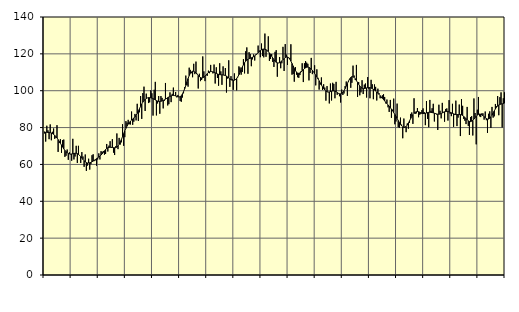
| Category | Piggar | Series 1 |
|---|---|---|
| nan | 77.8 | 76.91 |
| 87.0 | 72.4 | 77.47 |
| 87.0 | 81 | 77.44 |
| 87.0 | 78.5 | 77.36 |
| 87.0 | 73.7 | 77.3 |
| 87.0 | 81.7 | 77.23 |
| 87.0 | 73.1 | 77.07 |
| 87.0 | 77.7 | 76.74 |
| 87.0 | 79.5 | 76.33 |
| 87.0 | 73.9 | 75.8 |
| 87.0 | 74.5 | 75.13 |
| 87.0 | 81.3 | 74.35 |
| nan | 66.8 | 73.46 |
| 88.0 | 71.6 | 72.53 |
| 88.0 | 73.7 | 71.52 |
| 88.0 | 66.3 | 70.47 |
| 88.0 | 73.2 | 69.45 |
| 88.0 | 73.5 | 68.48 |
| 88.0 | 64.1 | 67.63 |
| 88.0 | 64.7 | 66.92 |
| 88.0 | 68.1 | 66.35 |
| 88.0 | 62.5 | 65.95 |
| 88.0 | 66.6 | 65.73 |
| 88.0 | 65.5 | 65.64 |
| nan | 62 | 65.68 |
| 89.0 | 73.9 | 65.81 |
| 89.0 | 62.7 | 65.97 |
| 89.0 | 64.3 | 66.07 |
| 89.0 | 70.1 | 66.05 |
| 89.0 | 60.8 | 65.84 |
| 89.0 | 70.1 | 65.46 |
| 89.0 | 65 | 64.93 |
| 89.0 | 60.8 | 64.23 |
| 89.0 | 66.7 | 63.44 |
| 89.0 | 64.3 | 62.65 |
| 89.0 | 58.7 | 61.94 |
| nan | 65.4 | 61.39 |
| 90.0 | 56.5 | 61 |
| 90.0 | 59.4 | 60.78 |
| 90.0 | 63.1 | 60.76 |
| 90.0 | 57.2 | 60.88 |
| 90.0 | 60.1 | 61.1 |
| 90.0 | 65 | 61.43 |
| 90.0 | 65.5 | 61.81 |
| 90.0 | 61.8 | 62.23 |
| 90.0 | 62.2 | 62.67 |
| 90.0 | 59.3 | 63.1 |
| 90.0 | 62.7 | 63.53 |
| nan | 66 | 63.99 |
| 91.0 | 62.7 | 64.49 |
| 91.0 | 67.2 | 65.08 |
| 91.0 | 66.8 | 65.78 |
| 91.0 | 67.3 | 66.55 |
| 91.0 | 65.3 | 67.35 |
| 91.0 | 65.7 | 68.09 |
| 91.0 | 71.1 | 68.66 |
| 91.0 | 67 | 69.05 |
| 91.0 | 70.2 | 69.28 |
| 91.0 | 72.6 | 69.33 |
| 91.0 | 69 | 69.28 |
| nan | 73.7 | 69.18 |
| 92.0 | 66.4 | 69.08 |
| 92.0 | 65.1 | 69.04 |
| 92.0 | 69.9 | 69.11 |
| 92.0 | 76.8 | 69.41 |
| 92.0 | 68.3 | 70 |
| 92.0 | 74.4 | 70.9 |
| 92.0 | 70.8 | 72.09 |
| 92.0 | 72 | 73.52 |
| 92.0 | 81.8 | 75.09 |
| 92.0 | 70.1 | 76.69 |
| 92.0 | 74.8 | 78.2 |
| nan | 83.5 | 79.59 |
| 93.0 | 82.7 | 80.82 |
| 93.0 | 84.2 | 81.87 |
| 93.0 | 81.8 | 82.77 |
| 93.0 | 81.7 | 83.51 |
| 93.0 | 88.7 | 84.09 |
| 93.0 | 81.5 | 84.62 |
| 93.0 | 83.2 | 85.16 |
| 93.0 | 87.4 | 85.82 |
| 93.0 | 83.9 | 86.65 |
| 93.0 | 92.9 | 87.69 |
| 93.0 | 83.6 | 88.93 |
| nan | 88.3 | 90.23 |
| 94.0 | 97.1 | 91.54 |
| 94.0 | 84.7 | 92.77 |
| 94.0 | 98.7 | 93.8 |
| 94.0 | 102.2 | 94.65 |
| 94.0 | 89 | 95.31 |
| 94.0 | 98.4 | 95.76 |
| 94.0 | 96.1 | 96.08 |
| 94.0 | 93.3 | 96.25 |
| 94.0 | 93.7 | 96.26 |
| 94.0 | 100.2 | 96.16 |
| 94.0 | 98.6 | 95.98 |
| nan | 86.5 | 95.71 |
| 95.0 | 100.5 | 95.35 |
| 95.0 | 104.8 | 94.97 |
| 95.0 | 86.6 | 94.65 |
| 95.0 | 93.1 | 94.37 |
| 95.0 | 97.1 | 94.2 |
| 95.0 | 87.5 | 94.18 |
| 95.0 | 97.1 | 94.26 |
| 95.0 | 96.1 | 94.45 |
| 95.0 | 90.4 | 94.73 |
| 95.0 | 94.5 | 95.06 |
| 95.0 | 104.2 | 95.43 |
| nan | 95.6 | 95.82 |
| 96.0 | 92 | 96.23 |
| 96.0 | 92.7 | 96.6 |
| 96.0 | 99.1 | 96.92 |
| 96.0 | 93.8 | 97.22 |
| 96.0 | 98.3 | 97.42 |
| 96.0 | 101.7 | 97.46 |
| 96.0 | 97.3 | 97.37 |
| 96.0 | 99.3 | 97.17 |
| 96.0 | 96.4 | 96.93 |
| 96.0 | 97.7 | 96.72 |
| 96.0 | 96.6 | 96.61 |
| nan | 94.4 | 96.75 |
| 97.0 | 94 | 97.25 |
| 97.0 | 96.3 | 98.19 |
| 97.0 | 98.6 | 99.49 |
| 97.0 | 101.9 | 101.09 |
| 97.0 | 108.2 | 102.91 |
| 97.0 | 103 | 104.81 |
| 97.0 | 102.2 | 106.61 |
| 97.0 | 112.5 | 108.19 |
| 97.0 | 111.3 | 109.43 |
| 97.0 | 109.5 | 110.22 |
| 97.0 | 107.3 | 110.58 |
| nan | 114.6 | 110.55 |
| 98.0 | 109 | 110.22 |
| 98.0 | 115.8 | 109.67 |
| 98.0 | 109.2 | 109 |
| 98.0 | 101.2 | 108.28 |
| 98.0 | 109.2 | 107.63 |
| 98.0 | 105.2 | 107.15 |
| 98.0 | 105.8 | 106.93 |
| 98.0 | 118.6 | 107.01 |
| 98.0 | 110.5 | 107.33 |
| 98.0 | 105.2 | 107.86 |
| 98.0 | 108.4 | 108.56 |
| nan | 108.1 | 109.27 |
| 99.0 | 110.9 | 109.84 |
| 99.0 | 109.5 | 110.23 |
| 99.0 | 114 | 110.4 |
| 99.0 | 110.4 | 110.39 |
| 99.0 | 109.4 | 110.22 |
| 99.0 | 114.2 | 109.97 |
| 99.0 | 103.9 | 109.7 |
| 99.0 | 112.7 | 109.39 |
| 99.0 | 106.9 | 109.11 |
| 99.0 | 102.7 | 108.87 |
| 99.0 | 114.9 | 108.72 |
| nan | 110.5 | 108.65 |
| 0.0 | 103.2 | 108.62 |
| 0.0 | 113.2 | 108.56 |
| 0.0 | 108.3 | 108.45 |
| 0.0 | 112.3 | 108.24 |
| 0.0 | 99 | 107.92 |
| 0.0 | 106.6 | 107.46 |
| 0.0 | 116.5 | 106.93 |
| 0.0 | 102.1 | 106.43 |
| 0.0 | 107.9 | 105.99 |
| 0.0 | 106.4 | 105.72 |
| 0.0 | 100.5 | 105.64 |
| nan | 109.4 | 105.71 |
| 1.0 | 106.3 | 106.04 |
| 1.0 | 100.2 | 106.66 |
| 1.0 | 107.3 | 107.52 |
| 1.0 | 113.2 | 108.64 |
| 1.0 | 112.6 | 109.97 |
| 1.0 | 108.7 | 111.41 |
| 1.0 | 110.2 | 112.82 |
| 1.0 | 117.1 | 114.08 |
| 1.0 | 109.4 | 115.18 |
| 1.0 | 121.4 | 116.02 |
| 1.0 | 123.5 | 116.63 |
| nan | 109.2 | 117.06 |
| 2.0 | 120.9 | 117.34 |
| 2.0 | 119.9 | 117.58 |
| 2.0 | 113.3 | 117.86 |
| 2.0 | 117 | 118.14 |
| 2.0 | 119.7 | 118.47 |
| 2.0 | 116.4 | 118.89 |
| 2.0 | 119.7 | 119.4 |
| 2.0 | 120 | 119.97 |
| 2.0 | 124.5 | 120.59 |
| 2.0 | 121.8 | 121.21 |
| 2.0 | 118.2 | 121.75 |
| nan | 125.6 | 122.21 |
| 3.0 | 118.8 | 122.53 |
| 3.0 | 118.1 | 122.62 |
| 3.0 | 131 | 122.51 |
| 3.0 | 118.4 | 122.24 |
| 3.0 | 121.9 | 121.79 |
| 3.0 | 129.5 | 121.19 |
| 3.0 | 116.2 | 120.49 |
| 3.0 | 117.2 | 119.64 |
| 3.0 | 119.9 | 118.7 |
| 3.0 | 115.6 | 117.72 |
| 3.0 | 112.9 | 116.77 |
| nan | 121.1 | 115.98 |
| 4.0 | 122 | 115.42 |
| 4.0 | 107.6 | 115.13 |
| 4.0 | 115 | 115.07 |
| 4.0 | 118.3 | 115.22 |
| 4.0 | 112.2 | 115.63 |
| 4.0 | 114.9 | 116.18 |
| 4.0 | 123.8 | 116.79 |
| 4.0 | 110.7 | 117.41 |
| 4.0 | 125.3 | 117.93 |
| 4.0 | 119.6 | 118.25 |
| 4.0 | 114 | 118.27 |
| nan | 118.1 | 117.92 |
| 5.0 | 117.8 | 117.14 |
| 5.0 | 125.2 | 116.05 |
| 5.0 | 108.7 | 114.78 |
| 5.0 | 109.1 | 113.41 |
| 5.0 | 104.9 | 112.07 |
| 5.0 | 112.8 | 110.91 |
| 5.0 | 108.7 | 110.04 |
| 5.0 | 107.3 | 109.55 |
| 5.0 | 107 | 109.44 |
| 5.0 | 108.5 | 109.64 |
| 5.0 | 110.6 | 110.11 |
| nan | 114.9 | 110.74 |
| 6.0 | 104.7 | 111.41 |
| 6.0 | 114.9 | 112 |
| 6.0 | 116.1 | 112.44 |
| 6.0 | 115.2 | 112.74 |
| 6.0 | 114.6 | 112.84 |
| 6.0 | 105.6 | 112.67 |
| 6.0 | 109.6 | 112.29 |
| 6.0 | 117.8 | 111.74 |
| 6.0 | 109 | 111.03 |
| 6.0 | 110.2 | 110.25 |
| 6.0 | 113.8 | 109.37 |
| nan | 102.9 | 108.43 |
| 7.0 | 111.6 | 107.45 |
| 7.0 | 107 | 106.44 |
| 7.0 | 100.6 | 105.37 |
| 7.0 | 103.4 | 104.25 |
| 7.0 | 107.2 | 103.12 |
| 7.0 | 100.4 | 102.08 |
| 7.0 | 103.5 | 101.16 |
| 7.0 | 101.7 | 100.39 |
| 7.0 | 94.6 | 99.79 |
| 7.0 | 102.5 | 99.43 |
| 7.0 | 99.2 | 99.3 |
| nan | 93.1 | 99.35 |
| 8.0 | 103.9 | 99.53 |
| 8.0 | 94.7 | 99.72 |
| 8.0 | 104.3 | 99.87 |
| 8.0 | 103.7 | 99.89 |
| 8.0 | 95.9 | 99.73 |
| 8.0 | 104.8 | 99.41 |
| 8.0 | 97.8 | 99 |
| 8.0 | 98.5 | 98.6 |
| 8.0 | 97 | 98.34 |
| 8.0 | 93.6 | 98.3 |
| 8.0 | 100.6 | 98.54 |
| nan | 97.7 | 99.11 |
| 9.0 | 98.5 | 99.99 |
| 9.0 | 102.5 | 101.14 |
| 9.0 | 105 | 102.49 |
| 9.0 | 97.2 | 103.9 |
| 9.0 | 104.9 | 105.26 |
| 9.0 | 106.1 | 106.41 |
| 9.0 | 101.6 | 107.21 |
| 9.0 | 104.3 | 107.62 |
| 9.0 | 113.6 | 107.6 |
| 9.0 | 108.2 | 107.21 |
| 9.0 | 105.8 | 106.48 |
| nan | 114 | 105.52 |
| 10.0 | 96.6 | 104.47 |
| 10.0 | 104.7 | 103.45 |
| 10.0 | 97.5 | 102.51 |
| 10.0 | 99.1 | 101.8 |
| 10.0 | 105.7 | 101.34 |
| 10.0 | 98.2 | 101.14 |
| 10.0 | 103.3 | 101.16 |
| 10.0 | 103.9 | 101.33 |
| 10.0 | 96.3 | 101.53 |
| 10.0 | 107.4 | 101.67 |
| 10.0 | 101 | 101.72 |
| nan | 95.9 | 101.63 |
| 11.0 | 105.9 | 101.42 |
| 11.0 | 103.5 | 101.14 |
| 11.0 | 95.4 | 100.77 |
| 11.0 | 103.4 | 100.34 |
| 11.0 | 102.1 | 99.83 |
| 11.0 | 94.7 | 99.26 |
| 11.0 | 101.1 | 98.64 |
| 11.0 | 98.7 | 97.99 |
| 11.0 | 95.9 | 97.33 |
| 11.0 | 96 | 96.62 |
| 11.0 | 97.5 | 95.88 |
| nan | 98.1 | 95.17 |
| 12.0 | 96.6 | 94.46 |
| 12.0 | 93.1 | 93.72 |
| 12.0 | 95.2 | 93 |
| 12.0 | 91 | 92.29 |
| 12.0 | 88.5 | 91.54 |
| 12.0 | 95 | 90.78 |
| 12.0 | 85.3 | 89.99 |
| 12.0 | 89.7 | 89.1 |
| 12.0 | 95.7 | 88.15 |
| 12.0 | 81.8 | 87.14 |
| 12.0 | 83.3 | 86.07 |
| nan | 93 | 84.97 |
| 13.0 | 80.2 | 83.85 |
| 13.0 | 79.8 | 82.75 |
| 13.0 | 85.4 | 81.75 |
| 13.0 | 81.6 | 80.92 |
| 13.0 | 74.2 | 80.34 |
| 13.0 | 84.9 | 80.08 |
| 13.0 | 80.4 | 80.16 |
| 13.0 | 77.5 | 80.62 |
| 13.0 | 82.2 | 81.39 |
| 13.0 | 79.4 | 82.43 |
| 13.0 | 82.6 | 83.65 |
| nan | 87.4 | 84.87 |
| 14.0 | 88.2 | 85.99 |
| 14.0 | 82 | 87 |
| 14.0 | 95.9 | 87.78 |
| 14.0 | 87.4 | 88.29 |
| 14.0 | 87.7 | 88.61 |
| 14.0 | 90.6 | 88.71 |
| 14.0 | 85.6 | 88.6 |
| 14.0 | 87 | 88.36 |
| 14.0 | 87.3 | 88.05 |
| 14.0 | 89.5 | 87.79 |
| 14.0 | 90.4 | 87.63 |
| nan | 88.4 | 87.6 |
| 15.0 | 81.3 | 87.72 |
| 15.0 | 94.4 | 87.93 |
| 15.0 | 84.7 | 88.14 |
| 15.0 | 80.2 | 88.28 |
| 15.0 | 95 | 88.33 |
| 15.0 | 89.1 | 88.27 |
| 15.0 | 90.5 | 88.15 |
| 15.0 | 92.9 | 87.99 |
| 15.0 | 83.3 | 87.79 |
| 15.0 | 87.4 | 87.6 |
| 15.0 | 87.1 | 87.4 |
| nan | 78.7 | 87.26 |
| 16.0 | 92.4 | 87.25 |
| 16.0 | 89.1 | 87.35 |
| 16.0 | 85 | 87.57 |
| 16.0 | 93.4 | 87.93 |
| 16.0 | 88.5 | 88.28 |
| 16.0 | 83.2 | 88.55 |
| 16.0 | 90.1 | 88.71 |
| 16.0 | 90.4 | 88.73 |
| 16.0 | 83.8 | 88.67 |
| 16.0 | 94.9 | 88.54 |
| 16.0 | 87.5 | 88.3 |
| nan | 86.2 | 88.02 |
| 17.0 | 92.9 | 87.73 |
| 17.0 | 80.4 | 87.46 |
| 17.0 | 86.8 | 87.23 |
| 17.0 | 94.6 | 87.07 |
| 17.0 | 80.8 | 87 |
| 17.0 | 85.4 | 87.02 |
| 17.0 | 92.5 | 87.06 |
| 17.0 | 75.4 | 87.05 |
| 17.0 | 95.5 | 86.89 |
| 17.0 | 91.8 | 86.53 |
| 17.0 | 84.7 | 86.04 |
| nan | 83.7 | 85.48 |
| 18.0 | 81.9 | 84.83 |
| 18.0 | 91.2 | 84.19 |
| 18.0 | 80.9 | 83.67 |
| 18.0 | 76 | 83.33 |
| 18.0 | 85.7 | 83.24 |
| 18.0 | 86.2 | 83.46 |
| 18.0 | 75.7 | 83.94 |
| 18.0 | 95.8 | 84.6 |
| 18.0 | 87.9 | 85.4 |
| 18.0 | 70.9 | 86.15 |
| 18.0 | 89.7 | 86.75 |
| nan | 96.6 | 87.17 |
| 19.0 | 86.1 | 87.34 |
| 19.0 | 85.7 | 87.24 |
| 19.0 | 87.7 | 86.91 |
| 19.0 | 87.7 | 86.44 |
| 19.0 | 84.3 | 85.91 |
| 19.0 | 88.7 | 85.34 |
| 19.0 | 84 | 84.89 |
| 19.0 | 77.1 | 84.65 |
| 19.0 | 87.5 | 84.64 |
| 19.0 | 88.8 | 85.04 |
| 19.0 | 79.8 | 85.82 |
| nan | 91.2 | 86.79 |
| 20.0 | 85.4 | 87.89 |
| 20.0 | 86.1 | 89.05 |
| 20.0 | 92.8 | 90.13 |
| 20.0 | 91.6 | 91.06 |
| 20.0 | 97.1 | 91.77 |
| 20.0 | 86.7 | 92.26 |
| 20.0 | 96.5 | 92.56 |
| 20.0 | 99.1 | 92.76 |
| 20.0 | 80.1 | 92.9 |
| 20.0 | 95.9 | 93.01 |
| 20.0 | 99.1 | 93.19 |